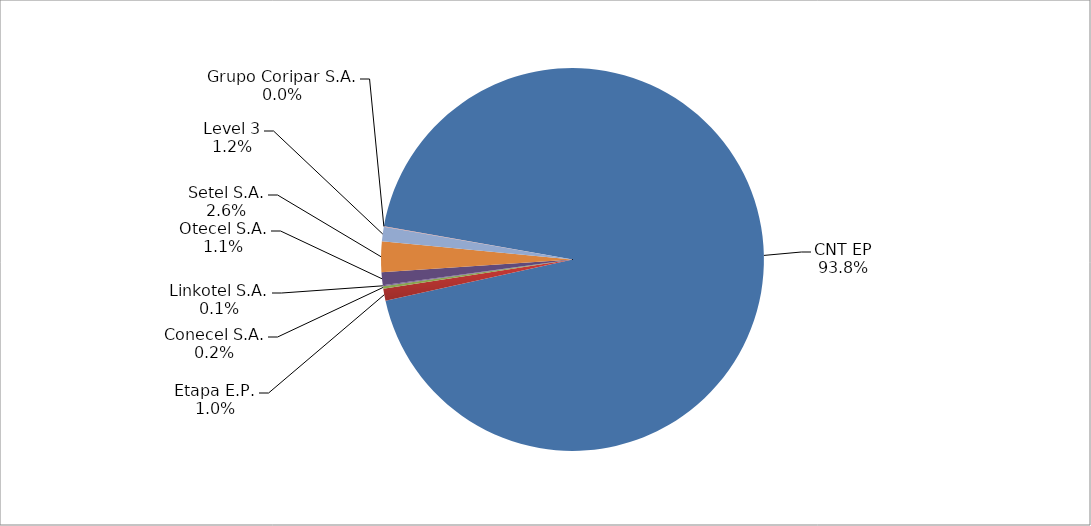
| Category | Series 0 |
|---|---|
| CNT EP | 2376 |
| Etapa E.P. | 26 |
| Conecel S.A. | 5 |
| Linkotel S.A. | 2 |
| Otecel S.A. | 28 |
| Setel S.A. | 65 |
| Level 3 | 31 |
| Grupo Coripar S.A. | 1 |